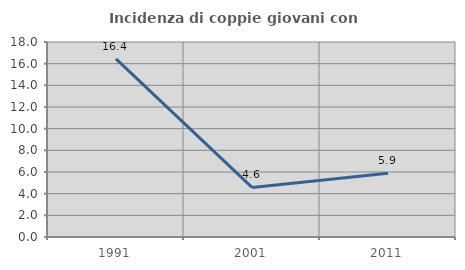
| Category | Incidenza di coppie giovani con figli |
|---|---|
| 1991.0 | 16.447 |
| 2001.0 | 4.575 |
| 2011.0 | 5.882 |